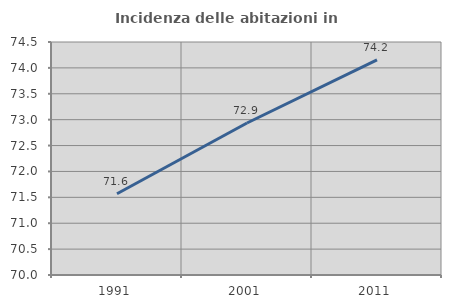
| Category | Incidenza delle abitazioni in proprietà  |
|---|---|
| 1991.0 | 71.569 |
| 2001.0 | 72.935 |
| 2011.0 | 74.154 |